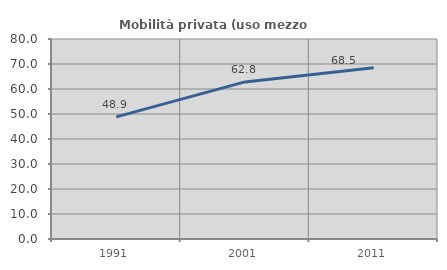
| Category | Mobilità privata (uso mezzo privato) |
|---|---|
| 1991.0 | 48.86 |
| 2001.0 | 62.831 |
| 2011.0 | 68.506 |